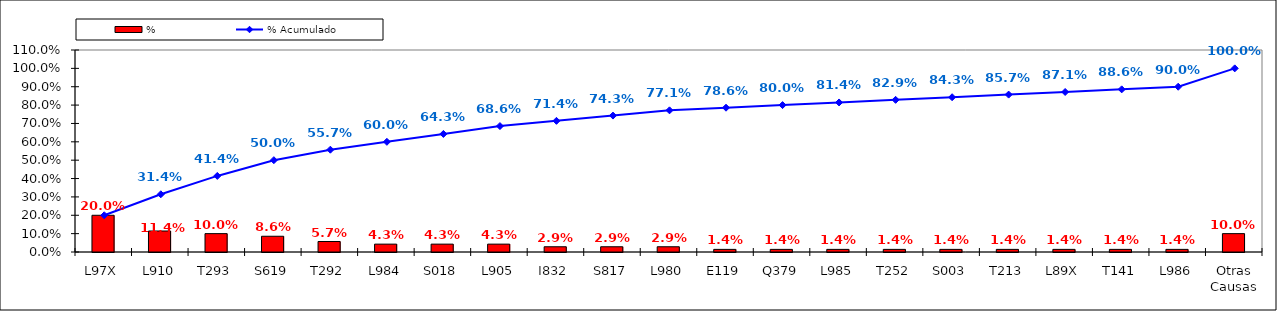
| Category | % |
|---|---|
| L97X | 0.2 |
| L910 | 0.114 |
| T293 | 0.1 |
| S619 | 0.086 |
| T292 | 0.057 |
| L984 | 0.043 |
| S018 | 0.043 |
| L905 | 0.043 |
| I832 | 0.029 |
| S817 | 0.029 |
| L980 | 0.029 |
| E119 | 0.014 |
| Q379 | 0.014 |
| L985 | 0.014 |
| T252 | 0.014 |
| S003 | 0.014 |
| T213 | 0.014 |
| L89X | 0.014 |
| T141 | 0.014 |
| L986 | 0.014 |
| Otras Causas | 0.1 |